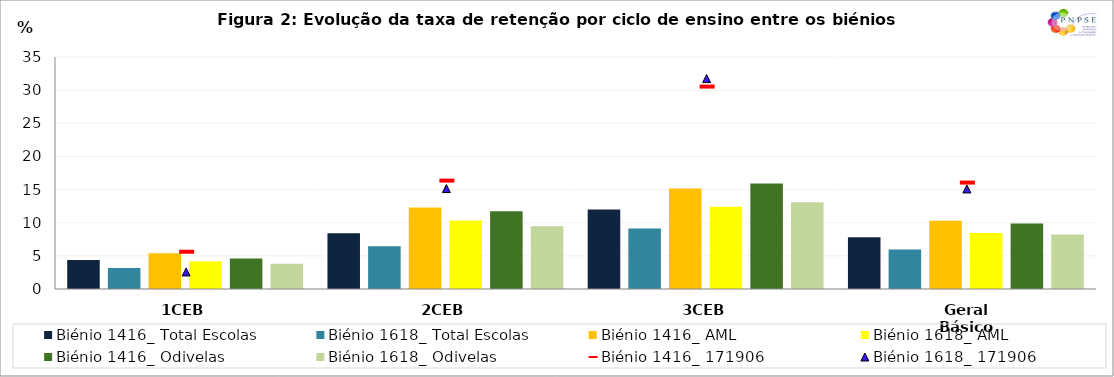
| Category | Biénio 1416_ | Biénio 1618_ |
|---|---|---|
| 1CEB | 4.587 | 3.801 |
| 2CEB | 11.733 | 9.46 |
| 3CEB | 15.925 | 13.082 |
| Geral Básico | 9.881 | 8.232 |